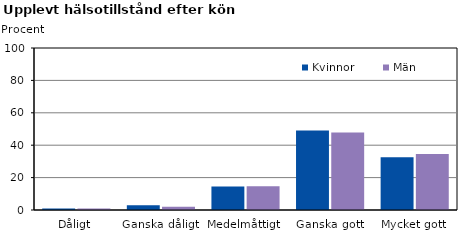
| Category | Kvinnor | Män |
|---|---|---|
| Dåligt | 1 | 1 |
| Ganska dåligt | 3 | 2 |
| Medelmåttigt | 14.5 | 14.6 |
| Ganska gott | 49 | 47.8 |
| Mycket gott | 32.5 | 34.6 |